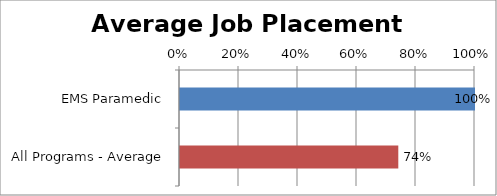
| Category | Series 0 |
|---|---|
| EMS Paramedic | 1 |
| All Programs - Average | 0.74 |